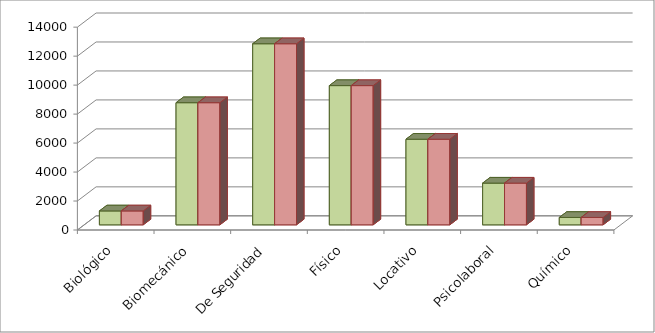
| Category | Series 0 | Series 1 |
|---|---|---|
| Biológico | 960 | 960 |
| Biomecánico | 8430 | 8430 |
| De Seguridad | 12500 | 12500 |
| Físico | 9610 | 9610 |
| Locativo | 5910 | 5910 |
| Psicolaboral | 2880 | 2880 |
| Químico | 510 | 510 |